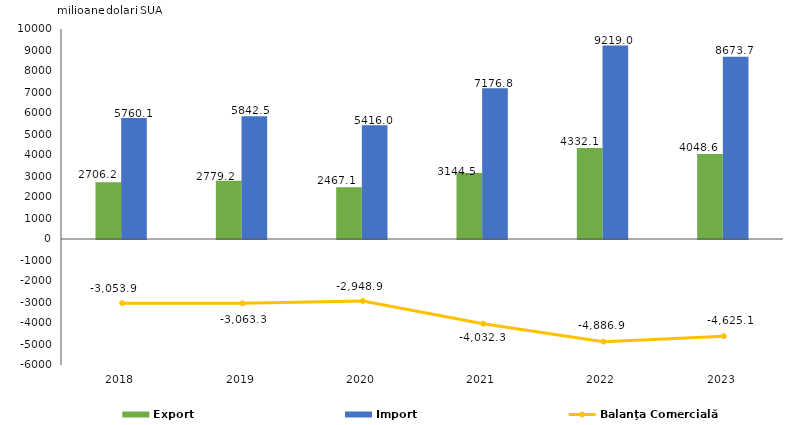
| Category | Export | Import |
|---|---|---|
| 2018.0 | 2706.2 | 5760.1 |
| 2019.0 | 2779.2 | 5842.5 |
| 2020.0 | 2467.1 | 5416 |
| 2021.0 | 3144.5 | 7176.8 |
| 2022.0 | 4332.1 | 9219 |
| 2023.0 | 4048.6 | 8673.7 |